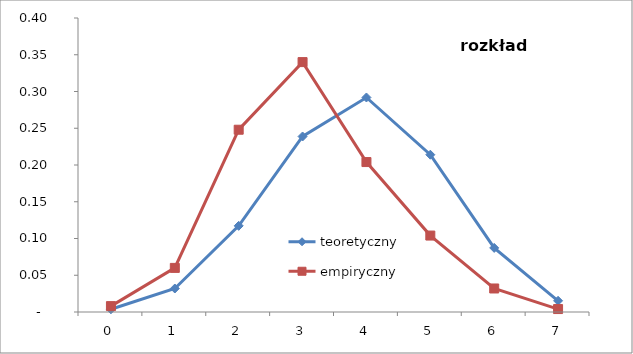
| Category | teoretyczny | empiryczny |
|---|---|---|
| 0.0 | 0.004 | 0.008 |
| 1.0 | 0.032 | 0.06 |
| 2.0 | 0.117 | 0.248 |
| 3.0 | 0.239 | 0.34 |
| 4.0 | 0.292 | 0.204 |
| 5.0 | 0.214 | 0.104 |
| 6.0 | 0.087 | 0.032 |
| 7.0 | 0.015 | 0.004 |